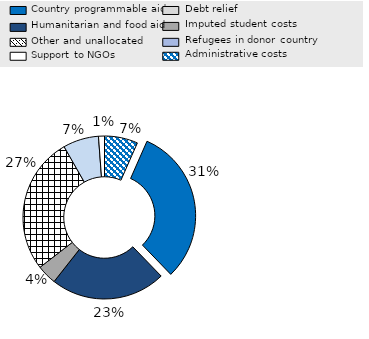
| Category | Series 0 |
|---|---|
| Administrative costs | 0.066 |
| Country programmable aid | 0.312 |
| Debt relief | 0 |
| Humanitarian and food aid | 0.228 |
| Imputed student costs | 0.039 |
| Other and unallocated | 0.272 |
| Refugees in donor country | 0.071 |
| Support to NGOs | 0.012 |